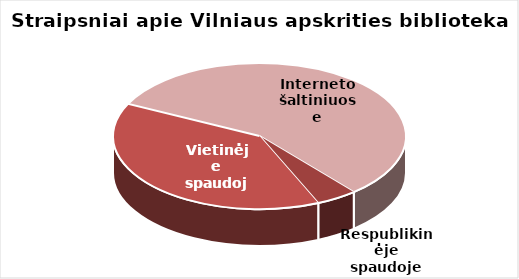
| Category | Series 0 |
|---|---|
| Respublikinėje spaudoje | 86 |
| Vietinėje spaudoje | 734 |
| Interneto šaltiniuose | 1070 |